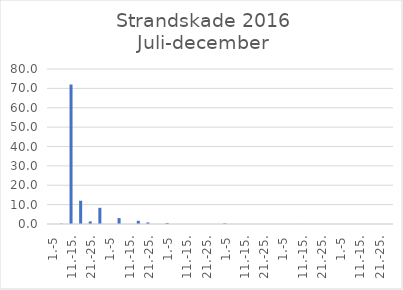
| Category | Series 0 |
|---|---|
| 1.-5 | 0 |
| 6.-10. | 0.173 |
| 11.-15. | 72 |
| 16.-20. | 12 |
| 21.-25. | 1.326 |
| 26.-31. | 8.356 |
| 1.-5 | 0 |
| 6.-10. | 3.052 |
| 11.-15. | 0 |
| 16.-20. | 1.65 |
| 21.-25. | 0.809 |
| 26.-31. | 0 |
| 1.-5 | 0.51 |
| 6.-10. | 0 |
| 11.-15. | 0 |
| 16.-20. | 0 |
| 21.-25. | 0 |
| 26.-30. | 0 |
| 1.-5 | 0.337 |
| 6.-10. | 0 |
| 11.-15. | 0.024 |
| 16.-20. | 0 |
| 21.-25. | 0 |
| 26.-31. | 0 |
| 1.-5 | 0 |
| 6.-10. | 0 |
| 11.-15. | 0.032 |
| 16.-20. | 0 |
| 21.-25. | 0 |
| 26.-30. | 0 |
| 1.-5 | 0 |
| 6.-10. | 0 |
| 11.-15. | 0 |
| 16.-20. | 0 |
| 21.-25. | 0 |
| 26.-31. | 0 |